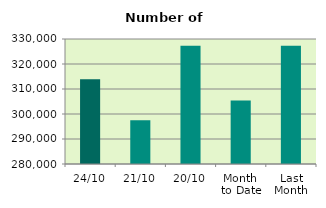
| Category | Series 0 |
|---|---|
| 24/10 | 313948 |
| 21/10 | 297548 |
| 20/10 | 327286 |
| Month 
to Date | 305422.5 |
| Last
Month | 327317.909 |